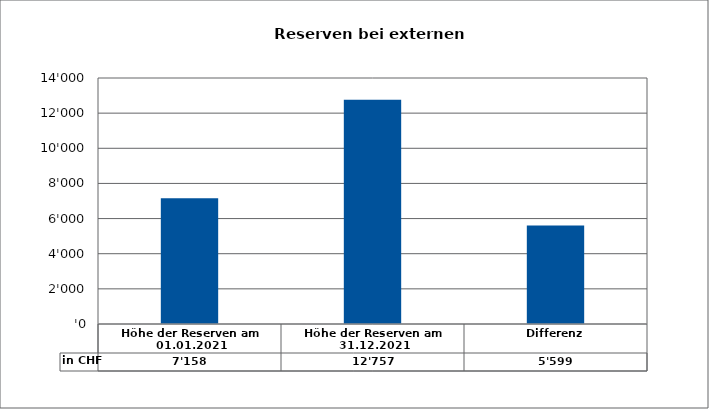
| Category | in CHF |
|---|---|
| Höhe der Reserven am 01.01.2021 | 7157.657 |
| Höhe der Reserven am 31.12.2021 | 12756.962 |
| Differenz | 5599.305 |